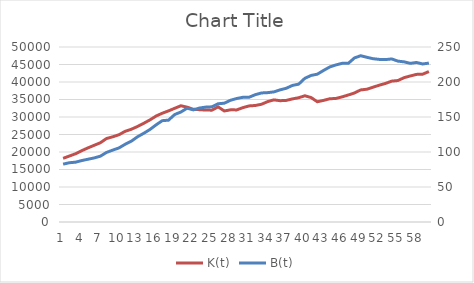
| Category | K(t) |
|---|---|
| 0 | 18188.341 |
| 1 | 18844.101 |
| 2 | 19492.017 |
| 3 | 20370.311 |
| 4 | 21168.516 |
| 5 | 21904.068 |
| 6 | 22632.85 |
| 7 | 23848.049 |
| 8 | 24344.744 |
| 9 | 24919.412 |
| 10 | 25910.355 |
| 11 | 26496.16 |
| 12 | 27283.164 |
| 13 | 28194.669 |
| 14 | 29165.456 |
| 15 | 30275.46 |
| 16 | 31080.057 |
| 17 | 31745.441 |
| 18 | 32485.847 |
| 19 | 33212.656 |
| 20 | 32803.37 |
| 21 | 32206.828 |
| 22 | 32094.646 |
| 23 | 31983.793 |
| 24 | 31955.818 |
| 25 | 32886.193 |
| 26 | 31727.071 |
| 27 | 32044.946 |
| 28 | 32031.121 |
| 29 | 32673.521 |
| 30 | 33166.864 |
| 31 | 33291.111 |
| 32 | 33644.319 |
| 33 | 34401.978 |
| 34 | 34896.921 |
| 35 | 34658.65 |
| 36 | 34744.93 |
| 37 | 35172.203 |
| 38 | 35509.287 |
| 39 | 36068.822 |
| 40 | 35554.724 |
| 41 | 34358.049 |
| 42 | 34743.084 |
| 43 | 35209.043 |
| 44 | 35301.636 |
| 45 | 35750.296 |
| 46 | 36289.436 |
| 47 | 36874.489 |
| 48 | 37736.849 |
| 49 | 37937.382 |
| 50 | 38513.266 |
| 51 | 39095.88 |
| 52 | 39590.844 |
| 53 | 40248.816 |
| 54 | 40420.303 |
| 55 | 41237.32 |
| 56 | 41729.148 |
| 57 | 42174.675 |
| 58 | 42237.803 |
| 59 | 42989.876 |